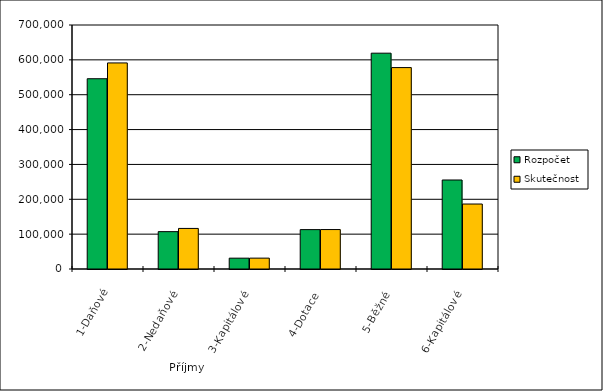
| Category | Rozpočet | Skutečnost |
|---|---|---|
| 1-Daňové | 545846.199 | 591193.065 |
| 2-Nedaňové | 107171.486 | 116382.049 |
| 3-Kapitálové | 31081.125 | 31165.656 |
| 4-Dotace | 112979.585 | 113171.585 |
| 5-Běžné | 619158.576 | 577820.854 |
| 6-Kapitálové | 255330.199 | 186402.371 |